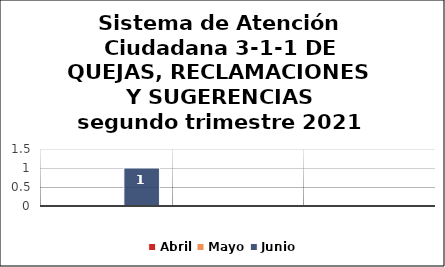
| Category | Abril | Mayo | Junio |
|---|---|---|---|
| Quejas | 0 | 0 | 1 |
| Reclamaciones | 0 | 0 | 0 |
| Sugerencias | 0 | 0 | 0 |